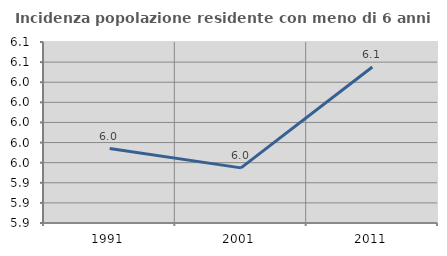
| Category | Incidenza popolazione residente con meno di 6 anni |
|---|---|
| 1991.0 | 5.974 |
| 2001.0 | 5.955 |
| 2011.0 | 6.055 |